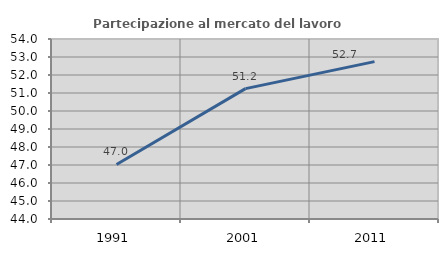
| Category | Partecipazione al mercato del lavoro  femminile |
|---|---|
| 1991.0 | 47.029 |
| 2001.0 | 51.244 |
| 2011.0 | 52.743 |